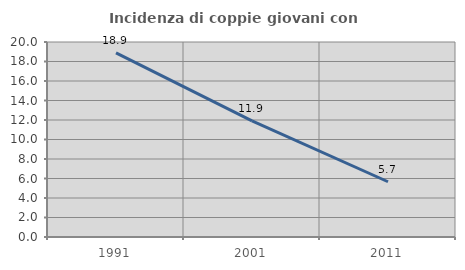
| Category | Incidenza di coppie giovani con figli |
|---|---|
| 1991.0 | 18.887 |
| 2001.0 | 11.916 |
| 2011.0 | 5.667 |